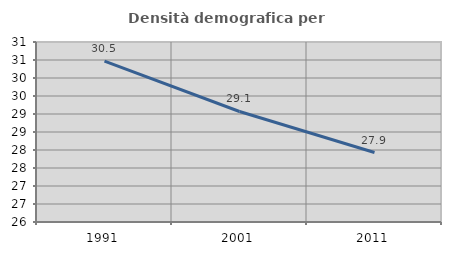
| Category | Densità demografica |
|---|---|
| 1991.0 | 30.469 |
| 2001.0 | 29.07 |
| 2011.0 | 27.93 |